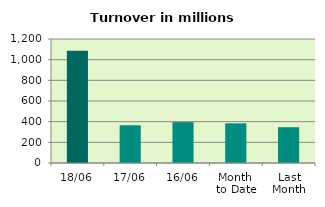
| Category | Series 0 |
|---|---|
| 18/06 | 1086.988 |
| 17/06 | 365.173 |
| 16/06 | 395.523 |
| Month 
to Date | 383.721 |
| Last
Month | 346.329 |